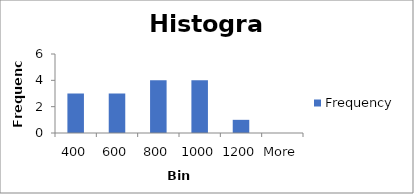
| Category | Frequency |
|---|---|
| 400 | 3 |
| 600 | 3 |
| 800 | 4 |
| 1000 | 4 |
| 1200 | 1 |
| More | 0 |